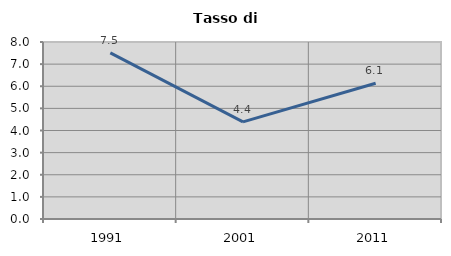
| Category | Tasso di disoccupazione   |
|---|---|
| 1991.0 | 7.506 |
| 2001.0 | 4.387 |
| 2011.0 | 6.138 |